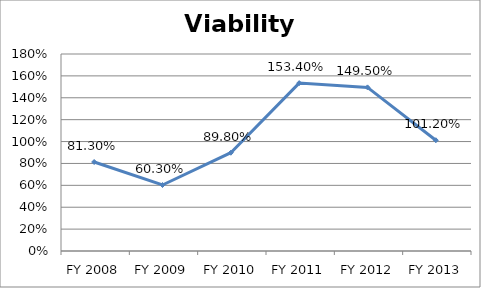
| Category | Viability ratio |
|---|---|
| FY 2013 | 1.012 |
| FY 2012 | 1.495 |
| FY 2011 | 1.534 |
| FY 2010 | 0.898 |
| FY 2009 | 0.603 |
| FY 2008 | 0.813 |